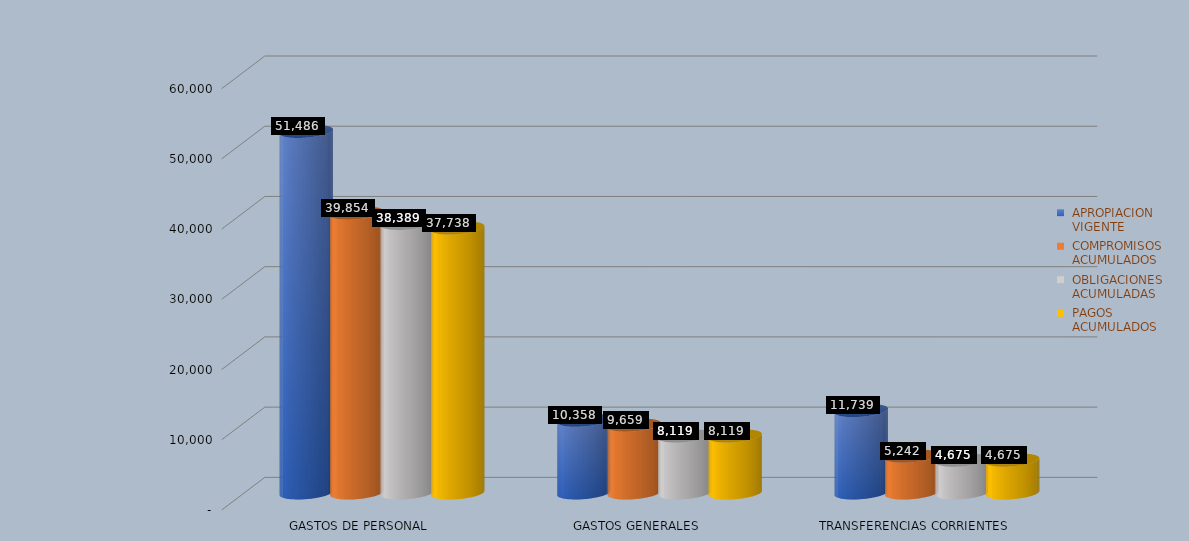
| Category |  APROPIACION
 VIGENTE |  COMPROMISOS
 ACUMULADOS |  OBLIGACIONES
 ACUMULADAS |  PAGOS
 ACUMULADOS |
|---|---|---|---|---|
| GASTOS DE PERSONAL | 51485.706 | 39853.568 | 38388.9 | 37737.99 |
| GASTOS GENERALES | 10357.915 | 9658.689 | 8119.465 | 8119.465 |
| TRANSFERENCIAS CORRIENTES | 11739.403 | 5241.655 | 4675.345 | 4675.345 |